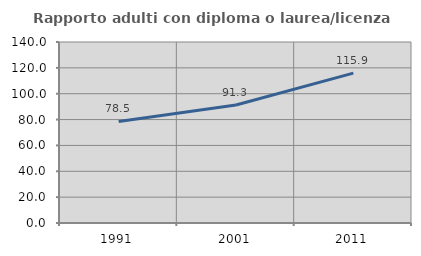
| Category | Rapporto adulti con diploma o laurea/licenza media  |
|---|---|
| 1991.0 | 78.521 |
| 2001.0 | 91.316 |
| 2011.0 | 115.925 |